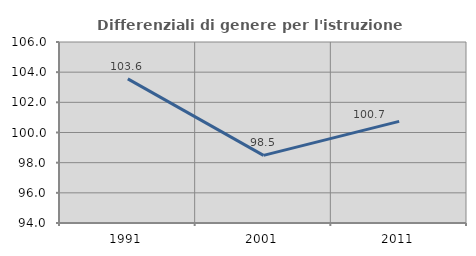
| Category | Differenziali di genere per l'istruzione superiore |
|---|---|
| 1991.0 | 103.555 |
| 2001.0 | 98.483 |
| 2011.0 | 100.736 |